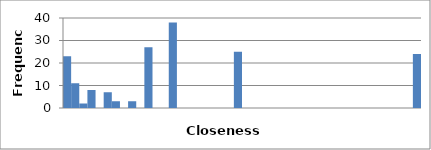
| Category | 23 |
|---|---|
| 0.015873 | 23 |
| 0.03875967441860465 | 11 |
| 0.061646348837209305 | 2 |
| 0.08453302325581395 | 8 |
| 0.1074196976744186 | 0 |
| 0.13030637209302326 | 7 |
| 0.1531930465116279 | 3 |
| 0.17607972093023255 | 0 |
| 0.1989663953488372 | 3 |
| 0.22185306976744185 | 0 |
| 0.2447397441860465 | 27 |
| 0.26762641860465114 | 0 |
| 0.2905130930232558 | 0 |
| 0.31339976744186043 | 38 |
| 0.3362864418604651 | 0 |
| 0.3591731162790697 | 0 |
| 0.3820597906976744 | 0 |
| 0.404946465116279 | 0 |
| 0.42783313953488367 | 0 |
| 0.4507198139534883 | 0 |
| 0.47360648837209296 | 0 |
| 0.4964931627906976 | 25 |
| 0.5193798372093023 | 0 |
| 0.542266511627907 | 0 |
| 0.5651531860465117 | 0 |
| 0.5880398604651164 | 0 |
| 0.6109265348837211 | 0 |
| 0.6338132093023258 | 0 |
| 0.6566998837209305 | 0 |
| 0.6795865581395352 | 0 |
| 0.7024732325581399 | 0 |
| 0.7253599069767446 | 0 |
| 0.7482465813953493 | 0 |
| 0.771133255813954 | 0 |
| 0.7940199302325587 | 0 |
| 0.8169066046511634 | 0 |
| 0.8397932790697681 | 0 |
| 0.8626799534883728 | 0 |
| 0.8855666279069775 | 0 |
| 0.9084533023255822 | 0 |
| 0.9313399767441869 | 0 |
| 0.9542266511627916 | 0 |
| 0.9771133255813963 | 0 |
| 1.0 | 24 |